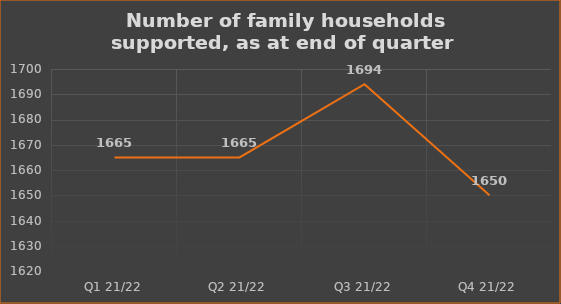
| Category | Number of financially supported households at end of quarter |
|---|---|
| Q1 21/22 | 1665 |
| Q2 21/22 | 1665 |
| Q3 21/22 | 1694 |
| Q4 21/22 | 1650 |